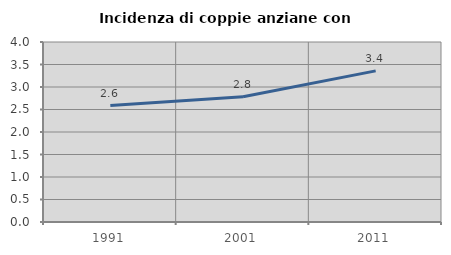
| Category | Incidenza di coppie anziane con figli |
|---|---|
| 1991.0 | 2.588 |
| 2001.0 | 2.783 |
| 2011.0 | 3.358 |